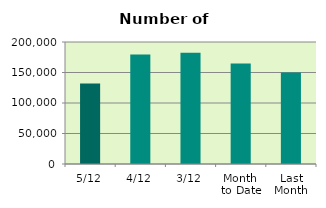
| Category | Series 0 |
|---|---|
| 5/12 | 131776 |
| 4/12 | 179498 |
| 3/12 | 182548 |
| Month 
to Date | 164607.333 |
| Last
Month | 150008.364 |